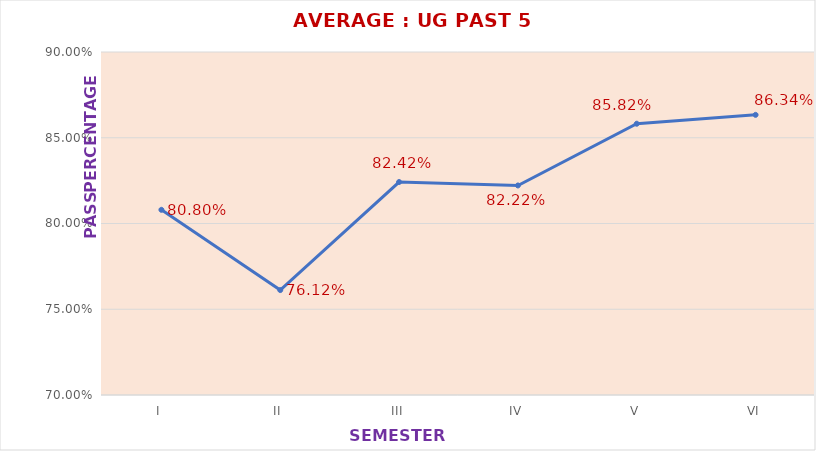
| Category | AVERAGE |
|---|---|
| I | 0.808 |
| II | 0.761 |
| III | 0.824 |
| IV | 0.822 |
| V | 0.858 |
| VI | 0.863 |